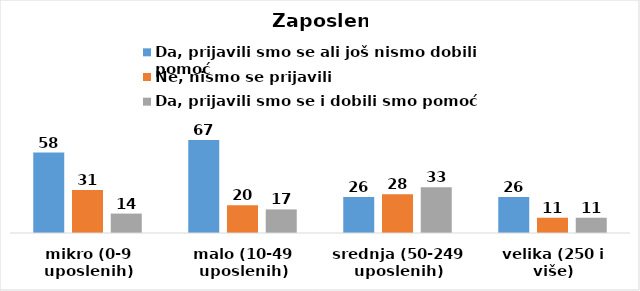
| Category | Da, prijavili smo se ali još nismo dobili pomoć | Ne, nismo se prijavili | Da, prijavili smo se i dobili smo pomoć |
|---|---|---|---|
| mikro (0-9 uposlenih) | 58 | 31 | 14 |
| malo (10-49 uposlenih) | 67 | 20 | 17 |
| srednja (50-249 uposlenih) | 26 | 28 | 33 |
| velika (250 i više) | 26 | 11 | 11 |